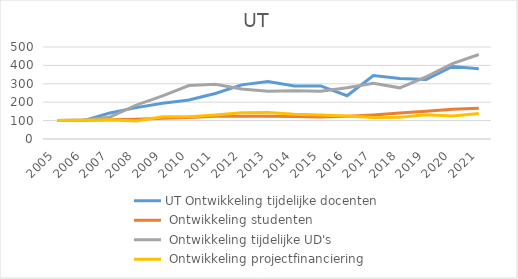
| Category | UT |
|---|---|
| 2005.0 | 100 |
| 2006.0 | 101.881 |
| 2007.0 | 104.075 |
| 2008.0 | 98.433 |
| 2009.0 | 121.003 |
| 2010.0 | 121.317 |
| 2011.0 | 130.721 |
| 2012.0 | 142.79 |
| 2013.0 | 144.201 |
| 2014.0 | 134.796 |
| 2015.0 | 130.408 |
| 2016.0 | 125.549 |
| 2017.0 | 116.614 |
| 2018.0 | 118.809 |
| 2019.0 | 131.505 |
| 2020.0 | 125.078 |
| 2021.0 | 138.401 |